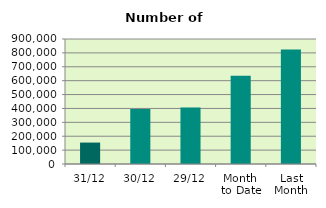
| Category | Series 0 |
|---|---|
| 31/12 | 154282 |
| 30/12 | 396552 |
| 29/12 | 406556 |
| Month 
to Date | 635205.478 |
| Last
Month | 823936.455 |